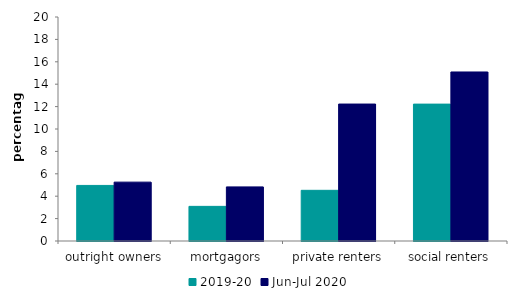
| Category | 2019-20 | Jun-Jul 2020 |
|---|---|---|
| outright owners | 4.962 | 5.256 |
| mortgagors | 3.092 | 4.83 |
| private renters | 4.525 | 12.228 |
| social renters | 12.222 | 15.092 |